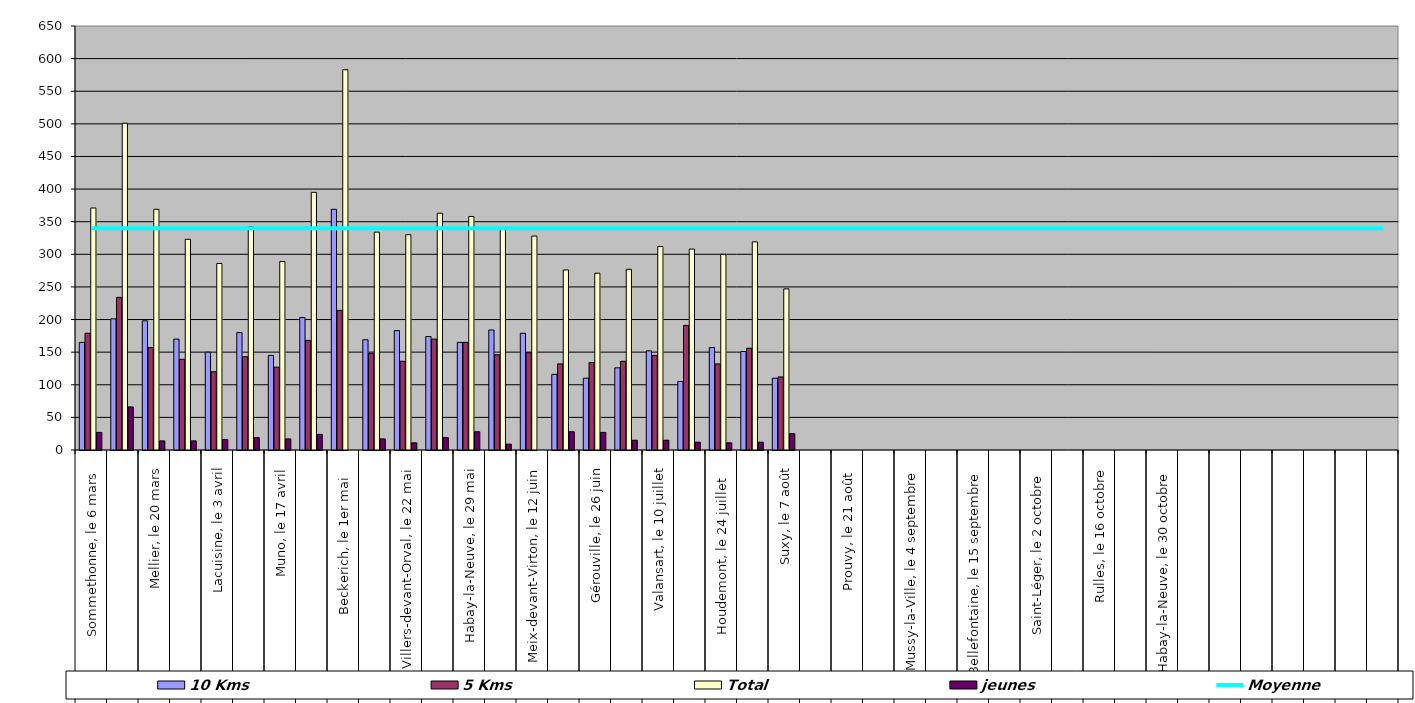
| Category | 10 Kms | 5 Kms | Total | jeunes |
|---|---|---|---|---|
| 0 | 165 | 179 | 371 | 27 |
| 1 | 201 | 234 | 501 | 66 |
| 2 | 198 | 157 | 369 | 14 |
| 3 | 170 | 139 | 323 | 14 |
| 4 | 150 | 120 | 286 | 16 |
| 5 | 180 | 143 | 342 | 19 |
| 6 | 145 | 127 | 289 | 17 |
| 7 | 203 | 168 | 395 | 24 |
| 8 | 369 | 214 | 583 | 0 |
| 9 | 169 | 148 | 334 | 17 |
| 10 | 183 | 136 | 330 | 11 |
| 11 | 174 | 170 | 363 | 19 |
| 12 | 165 | 165 | 358 | 28 |
| 13 | 184 | 146 | 339 | 9 |
| 14 | 179 | 149 | 328 | 0 |
| 15 | 116 | 132 | 276 | 28 |
| 16 | 110 | 134 | 271 | 27 |
| 17 | 126 | 136 | 277 | 15 |
| 18 | 152 | 145 | 312 | 15 |
| 19 | 105 | 191 | 308 | 12 |
| 20 | 157 | 132 | 300 | 11 |
| 21 | 151 | 156 | 319 | 12 |
| 22 | 110 | 112 | 247 | 25 |
| 23 | 0 | 0 | 0 | 0 |
| 24 | 0 | 0 | 0 | 0 |
| 25 | 0 | 0 | 0 | 0 |
| 26 | 0 | 0 | 0 | 0 |
| 27 | 0 | 0 | 0 | 0 |
| 28 | 0 | 0 | 0 | 0 |
| 29 | 0 | 0 | 0 | 0 |
| 30 | 0 | 0 | 0 | 0 |
| 31 | 0 | 0 | 0 | 0 |
| 32 | 0 | 0 | 0 | 0 |
| 33 | 0 | 0 | 0 | 0 |
| 34 | 0 | 0 | 0 | 0 |
| 35 | 0 | 0 | 0 | 0 |
| 36 | 0 | 0 | 0 | 0 |
| 37 | 0 | 0 | 0 | 0 |
| 38 | 0 | 0 | 0 | 0 |
| 39 | 0 | 0 | 0 | 0 |
| 40 | 0 | 0 | 0 | 0 |
| 41 | 0 | 0 | 0 | 0 |